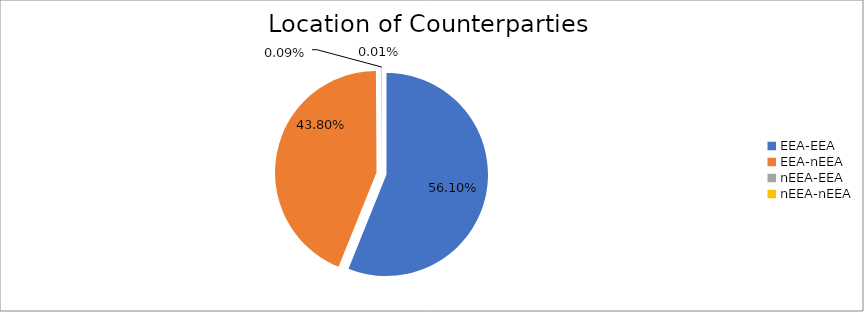
| Category | Series 0 |
|---|---|
| EEA-EEA | 7373778.164 |
| EEA-nEEA | 5756708.733 |
| nEEA-EEA | 11589.704 |
| nEEA-nEEA | 1022.639 |